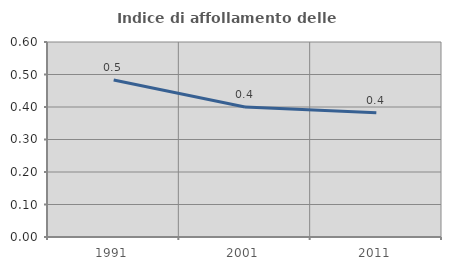
| Category | Indice di affollamento delle abitazioni  |
|---|---|
| 1991.0 | 0.483 |
| 2001.0 | 0.4 |
| 2011.0 | 0.382 |